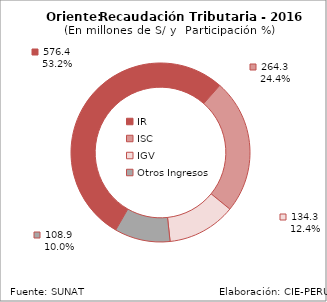
| Category | 2016 |
|---|---|
| IR | 576.388 |
| ISC | 264.334 |
| IGV | 134.271 |
| Otros Ingresos | 108.851 |